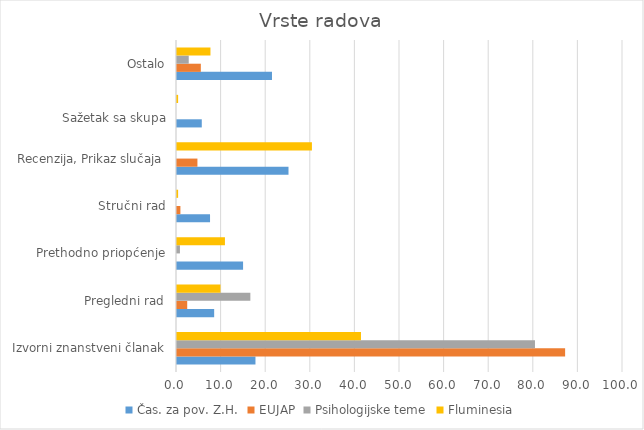
| Category | Čas. za pov. Z.H. | EUJAP | Psihologijske teme | Fluminesia |
|---|---|---|---|---|
| Izvorni znanstveni članak | 17.593 | 87.023 | 80.263 | 41.25 |
| Pregledni rad | 8.333 | 2.29 | 16.447 | 9.75 |
| Prethodno priopćenje | 14.815 | 0 | 0.658 | 10.75 |
| Stručni rad | 7.407 | 0.763 | 0 | 0.25 |
| Recenzija, Prikaz slučaja | 25 | 4.58 | 0 | 30.25 |
| 
Sažetak sa skupa | 5.556 | 0 | 0 | 0.25 |
| Ostalo | 21.296 | 5.344 | 2.632 | 7.5 |